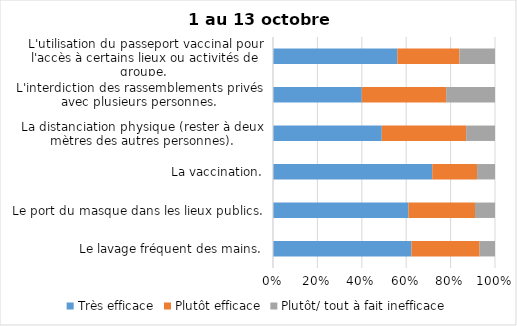
| Category | Très efficace | Plutôt efficace | Plutôt/ tout à fait inefficace |
|---|---|---|---|
| Le lavage fréquent des mains. | 63 | 31 | 7 |
| Le port du masque dans les lieux publics. | 61 | 30 | 9 |
| La vaccination. | 71 | 20 | 8 |
| La distanciation physique (rester à deux mètres des autres personnes). | 49 | 38 | 13 |
| L'interdiction des rassemblements privés avec plusieurs personnes. | 40 | 38 | 22 |
| L'utilisation du passeport vaccinal pour l'accès à certains lieux ou activités de groupe.  | 56 | 28 | 16 |